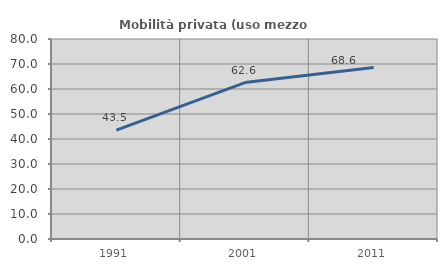
| Category | Mobilità privata (uso mezzo privato) |
|---|---|
| 1991.0 | 43.542 |
| 2001.0 | 62.579 |
| 2011.0 | 68.597 |